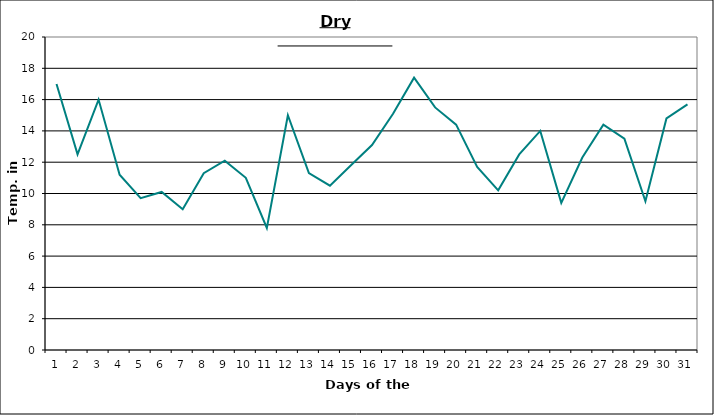
| Category | Series 0 |
|---|---|
| 0 | 17 |
| 1 | 12.5 |
| 2 | 16 |
| 3 | 11.2 |
| 4 | 9.7 |
| 5 | 10.1 |
| 6 | 9 |
| 7 | 11.3 |
| 8 | 12.1 |
| 9 | 11 |
| 10 | 7.8 |
| 11 | 15 |
| 12 | 11.3 |
| 13 | 10.5 |
| 14 | 11.8 |
| 15 | 13.1 |
| 16 | 15.1 |
| 17 | 17.4 |
| 18 | 15.5 |
| 19 | 14.4 |
| 20 | 11.7 |
| 21 | 10.2 |
| 22 | 12.5 |
| 23 | 14 |
| 24 | 9.4 |
| 25 | 12.3 |
| 26 | 14.4 |
| 27 | 13.5 |
| 28 | 9.5 |
| 29 | 14.8 |
| 30 | 15.7 |